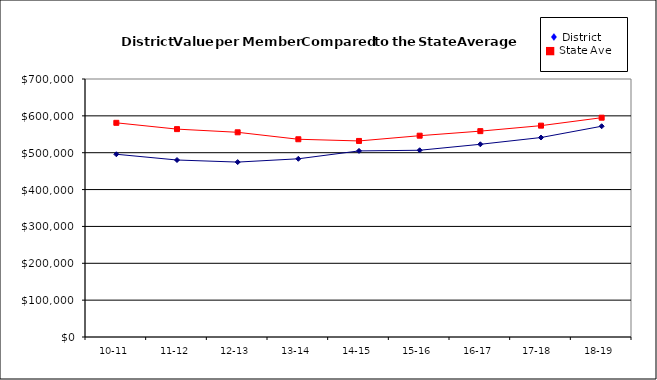
| Category | Series 0 | Series 1 |
|---|---|---|
| 10-11 | 495812 | 581087 |
| 11-12 | 480200 | 564023 |
| 12-13 | 474560 | 555356 |
| 13-14 | 483529 | 536523 |
| 14-15 | 504883 | 531951 |
| 15-16 | 506666 | 546173 |
| 16-17 | 522870 | 558546 |
| 17-18  | 541224 | 573441 |
| 18-19 | 571829 | 595017 |